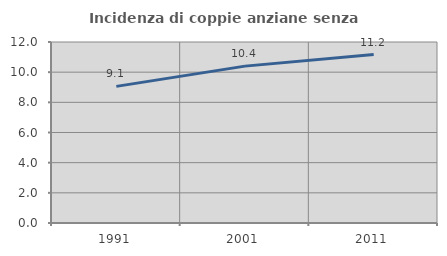
| Category | Incidenza di coppie anziane senza figli  |
|---|---|
| 1991.0 | 9.058 |
| 2001.0 | 10.4 |
| 2011.0 | 11.166 |